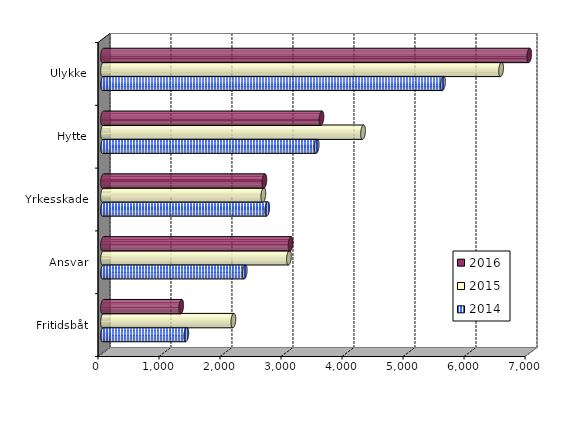
| Category | 2014 | 2015 | 2016 |
|---|---|---|---|
| Fritidsbåt | 1365 | 2137 | 1281.456 |
| Ansvar | 2323 | 3048 | 3075.12 |
| Yrkesskade | 2692 | 2628 | 2645 |
| Hytte | 3502 | 4262 | 3580.662 |
| Ulykke | 5572.091 | 6525 | 6986 |